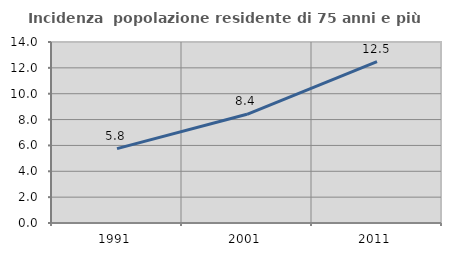
| Category | Incidenza  popolazione residente di 75 anni e più |
|---|---|
| 1991.0 | 5.755 |
| 2001.0 | 8.41 |
| 2011.0 | 12.476 |